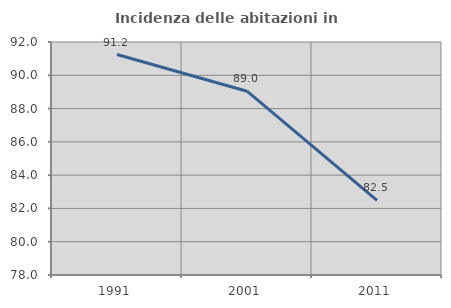
| Category | Incidenza delle abitazioni in proprietà  |
|---|---|
| 1991.0 | 91.247 |
| 2001.0 | 89.044 |
| 2011.0 | 82.48 |